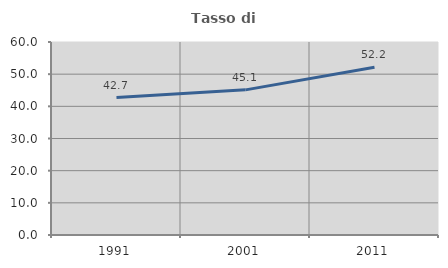
| Category | Tasso di occupazione   |
|---|---|
| 1991.0 | 42.739 |
| 2001.0 | 45.122 |
| 2011.0 | 52.174 |